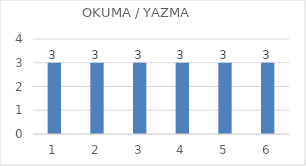
| Category | Series 0 |
|---|---|
| 0 | 3 |
| 1 | 3 |
| 2 | 3 |
| 3 | 3 |
| 4 | 3 |
| 5 | 3 |